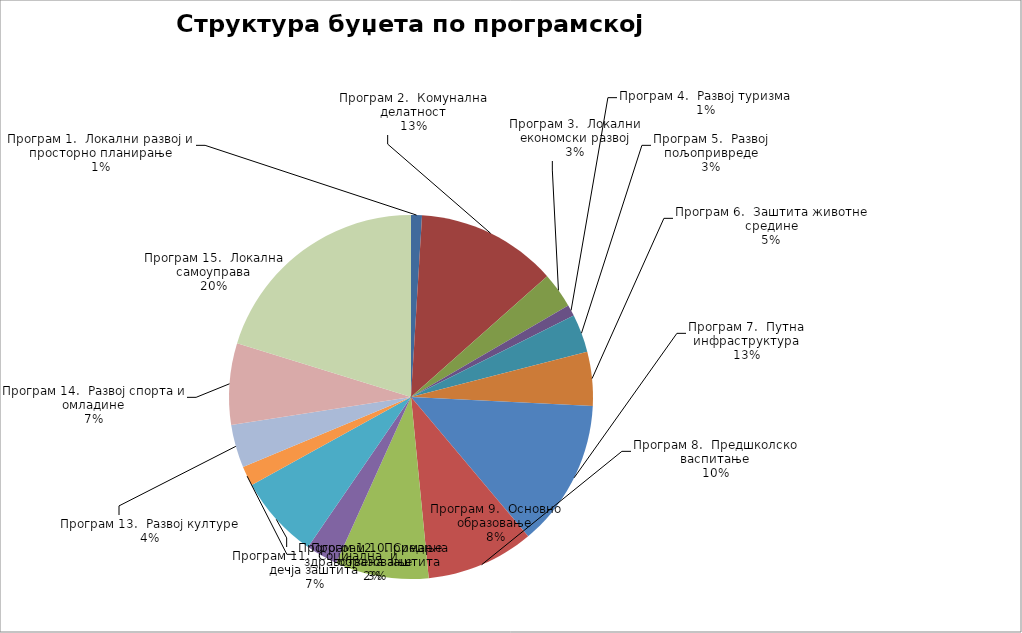
| Category | Series 0 |
|---|---|
| Програм 1.  Локални развој и просторно планирање | 7700000 |
| Програм 2.  Комунална делатност | 99270000 |
| Програм 3.  Локални економски развој | 25080000 |
| Програм 4.  Развој туризма | 8000000 |
| Програм 5.  Развој пољопривреде | 26900000 |
| Програм 6.  Заштита животне средине | 38030000 |
| Програм 7.  Путна инфраструктура | 104100000 |
| Програм 8.  Предшколско васпитање | 76150000 |
| Програм 9.  Основно образовање | 66000000 |
| Програм 10. Средње образовање | 22500000 |
| Програм 11.  Социјална  и дечја заштита | 58710000 |
| Програм 12.  Примарна здравствена заштита | 14000000 |
| Програм 13.  Развој културе | 30400000 |
| Програм 14.  Развој спорта и омладине | 57460000 |
| Програм 15.  Локална самоуправа | 160880000 |